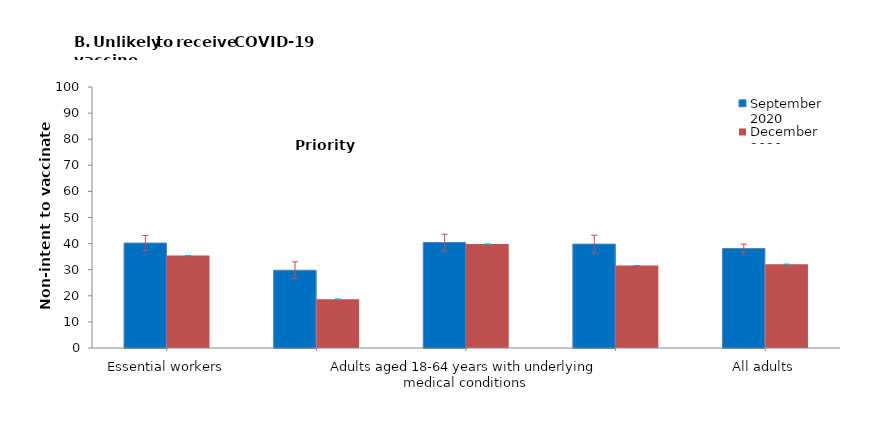
| Category | September 2020 | December 2020 |
|---|---|---|
| Essential workers | 40.2 | 35.4 |
| Adults aged ≥65 years | 29.8 | 18.7 |
| Adults aged 18-64 years with underlying medical conditions | 40.4 | 39.8 |
| Adults aged 18-64 years without underlying medical conditions and non-essential workers | 39.8 | 31.6 |
| All adults | 38.1 | 32.1 |